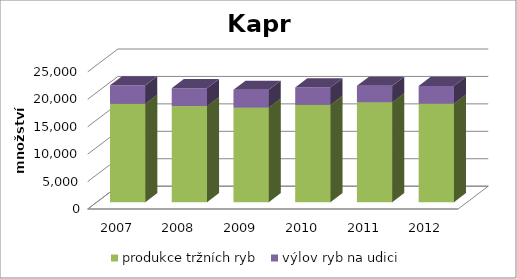
| Category | produkce tržních ryb | výlov ryb na udici |
|---|---|---|
| 2007.0 | 17947 | 3341 |
| 2008.0 | 17507 | 3257 |
| 2009.0 | 17258 | 3214 |
| 2010.0 | 17746 | 3161 |
| 2011.0 | 18198 | 2997 |
| 2012.0 | 17972 | 3207 |